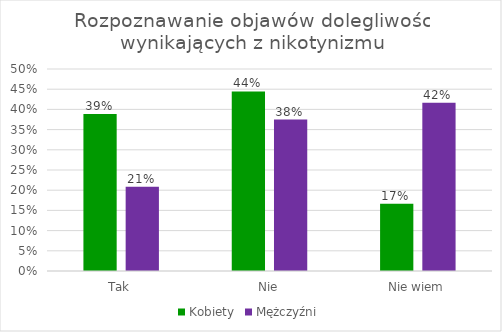
| Category | Kobiety | Mężczyźni |
|---|---|---|
| Tak | 0.389 | 0.208 |
| Nie | 0.444 | 0.375 |
| Nie wiem | 0.167 | 0.417 |